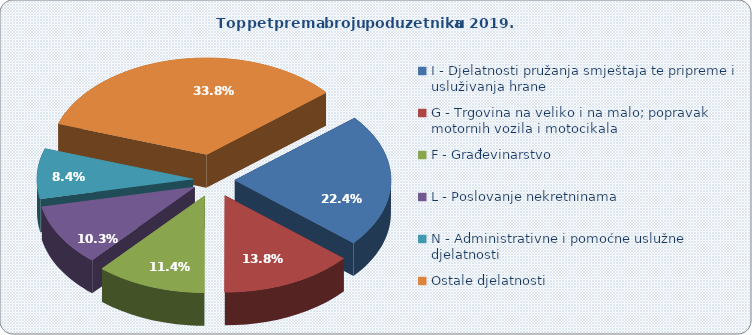
| Category | Broj poduzetnika 2019 |
|---|---|
| I - Djelatnosti pružanja smještaja te pripreme i usluživanja hrane  | 1108 |
| G - Trgovina na veliko i na malo; popravak motornih vozila i motocikala | 682 |
| F - Građevinarstvo | 564 |
| L - Poslovanje nekretninama | 511 |
| N - Administrativne i pomoćne uslužne djelatnosti | 416 |
| Ostale djelatnosti | 1673 |